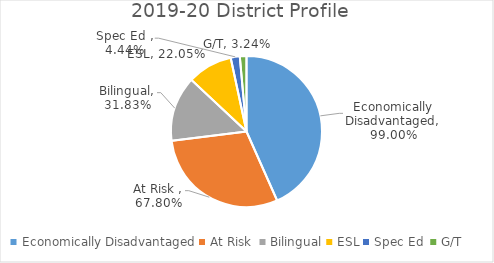
| Category | Series 0 |
|---|---|
| Economically Disadvantaged | 0.99 |
| At Risk  | 0.678 |
| Bilingual | 0.318 |
| ESL | 0.22 |
| Spec Ed  | 0.044 |
| G/T | 0.032 |